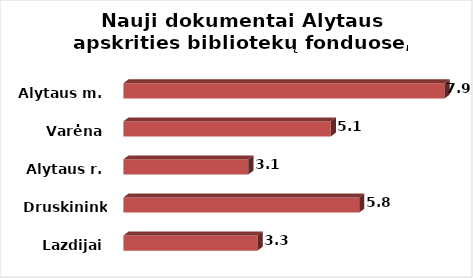
| Category | Series 0 |
|---|---|
| Lazdijai | 3.3 |
| Druskininkai | 5.8 |
| Alytaus r. | 3.07 |
| Varėna | 5.1 |
| Alytaus m. | 7.9 |